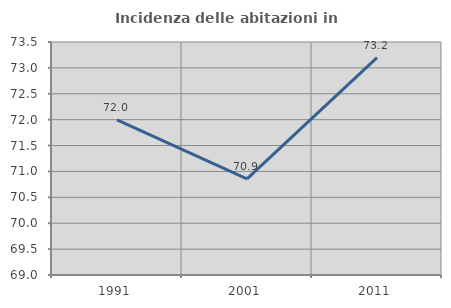
| Category | Incidenza delle abitazioni in proprietà  |
|---|---|
| 1991.0 | 71.996 |
| 2001.0 | 70.856 |
| 2011.0 | 73.2 |